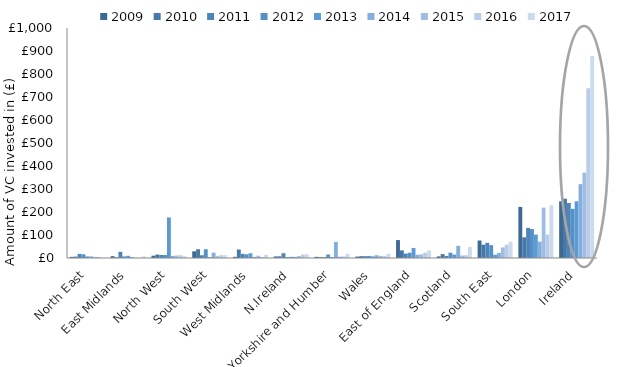
| Category | 2009 | 2010 | 2011 | 2012 | 2013 | 2014 | 2015 | 2016 | 2017 |
|---|---|---|---|---|---|---|---|---|---|
| North East | 5 | 6 | 18 | 16 | 6.959 | 7 | 5 | 4 | 1 |
| East Midlands | 8 | 3 | 27 | 7 | 9.52 | 4 | 1 | 1 | 7 |
| North West | 10 | 15 | 13 | 13 | 176.31 | 9 | 11 | 12 | 8 |
| South West | 29 | 38 | 12 | 38 | 3.757 | 23 | 8 | 12 | 12 |
| West Midlands | 5 | 37 | 18 | 16 | 20.483 | 5 | 10 | 4 | 14 |
| N.Ireland | 6.764 | 7.363 | 20.78 | 4.108 | 5.061 | 4.99 | 8.43 | 14.83 | 16.04 |
| Yorkshire and Humber | 5 | 4 | 4 | 15 | 4.09 | 70 | 6 | 7 | 18 |
| Wales | 6 | 8 | 8 | 9 | 7.177 | 12 | 9 | 9 | 18 |
| East of England | 78 | 33 | 19 | 23 | 43.714 | 14 | 16 | 23 | 33 |
| Scotland | 7 | 17 | 9 | 23 | 14.953 | 53 | 11 | 12 | 48 |
| South East | 76 | 58 | 66 | 56 | 13.659 | 22 | 46 | 58 | 71 |
| London | 222 | 90 | 131 | 126 | 101.967 | 71 | 219 | 102 | 229 |
| Ireland | 246.553 | 257.863 | 239.194 | 213.815 | 246.478 | 321.119 | 371.228 | 738.062 | 877.841 |